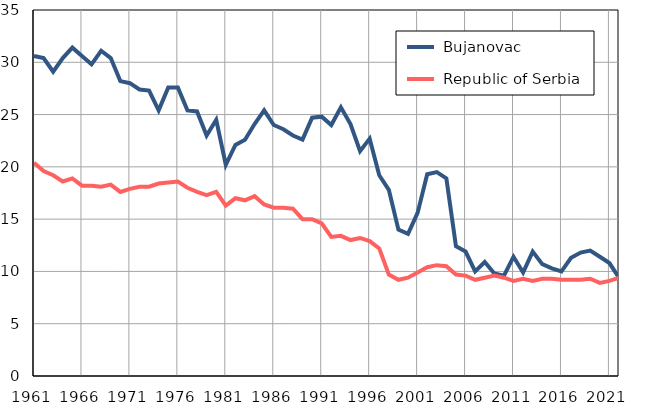
| Category |  Bujanovac |  Republic of Serbia |
|---|---|---|
| 1961.0 | 30.6 | 20.4 |
| 1962.0 | 30.4 | 19.6 |
| 1963.0 | 29.1 | 19.2 |
| 1964.0 | 30.4 | 18.6 |
| 1965.0 | 31.4 | 18.9 |
| 1966.0 | 30.6 | 18.2 |
| 1967.0 | 29.8 | 18.2 |
| 1968.0 | 31.1 | 18.1 |
| 1969.0 | 30.4 | 18.3 |
| 1970.0 | 28.2 | 17.6 |
| 1971.0 | 28 | 17.9 |
| 1972.0 | 27.4 | 18.1 |
| 1973.0 | 27.3 | 18.1 |
| 1974.0 | 25.4 | 18.4 |
| 1975.0 | 27.6 | 18.5 |
| 1976.0 | 27.6 | 18.6 |
| 1977.0 | 25.4 | 18 |
| 1978.0 | 25.3 | 17.6 |
| 1979.0 | 23 | 17.3 |
| 1980.0 | 24.5 | 17.6 |
| 1981.0 | 20.2 | 16.3 |
| 1982.0 | 22.1 | 17 |
| 1983.0 | 22.6 | 16.8 |
| 1984.0 | 24.1 | 17.2 |
| 1985.0 | 25.4 | 16.4 |
| 1986.0 | 24 | 16.1 |
| 1987.0 | 23.6 | 16.1 |
| 1988.0 | 23 | 16 |
| 1989.0 | 22.6 | 15 |
| 1990.0 | 24.7 | 15 |
| 1991.0 | 24.8 | 14.6 |
| 1992.0 | 24 | 13.3 |
| 1993.0 | 25.7 | 13.4 |
| 1994.0 | 24.1 | 13 |
| 1995.0 | 21.5 | 13.2 |
| 1996.0 | 22.7 | 12.9 |
| 1997.0 | 19.2 | 12.2 |
| 1998.0 | 17.8 | 9.7 |
| 1999.0 | 14 | 9.2 |
| 2000.0 | 13.6 | 9.4 |
| 2001.0 | 15.6 | 9.9 |
| 2002.0 | 19.3 | 10.4 |
| 2003.0 | 19.5 | 10.6 |
| 2004.0 | 18.9 | 10.5 |
| 2005.0 | 12.4 | 9.7 |
| 2006.0 | 11.9 | 9.6 |
| 2007.0 | 10 | 9.2 |
| 2008.0 | 10.9 | 9.4 |
| 2009.0 | 9.8 | 9.6 |
| 2010.0 | 9.6 | 9.4 |
| 2011.0 | 11.4 | 9.1 |
| 2012.0 | 9.9 | 9.3 |
| 2013.0 | 11.9 | 9.1 |
| 2014.0 | 10.7 | 9.3 |
| 2015.0 | 10.3 | 9.3 |
| 2016.0 | 10 | 9.2 |
| 2017.0 | 11.3 | 9.2 |
| 2018.0 | 11.8 | 9.2 |
| 2019.0 | 12 | 9.3 |
| 2020.0 | 11.4 | 8.9 |
| 2021.0 | 10.8 | 9.1 |
| 2022.0 | 9.4 | 9.4 |